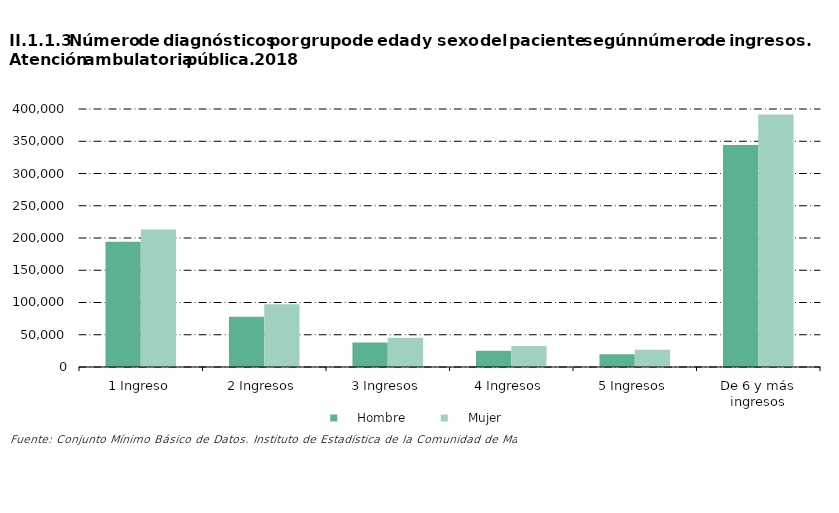
| Category |     Hombre |     Mujer |
|---|---|---|
| 1 Ingreso | 194023 | 213272 |
| 2 Ingresos | 77911 | 97436 |
| 3 Ingresos | 37804 | 45416 |
| 4 Ingresos | 25321 | 32539 |
| 5 Ingresos | 19712 | 26878 |
| De 6 y más ingresos | 344374 | 391457 |